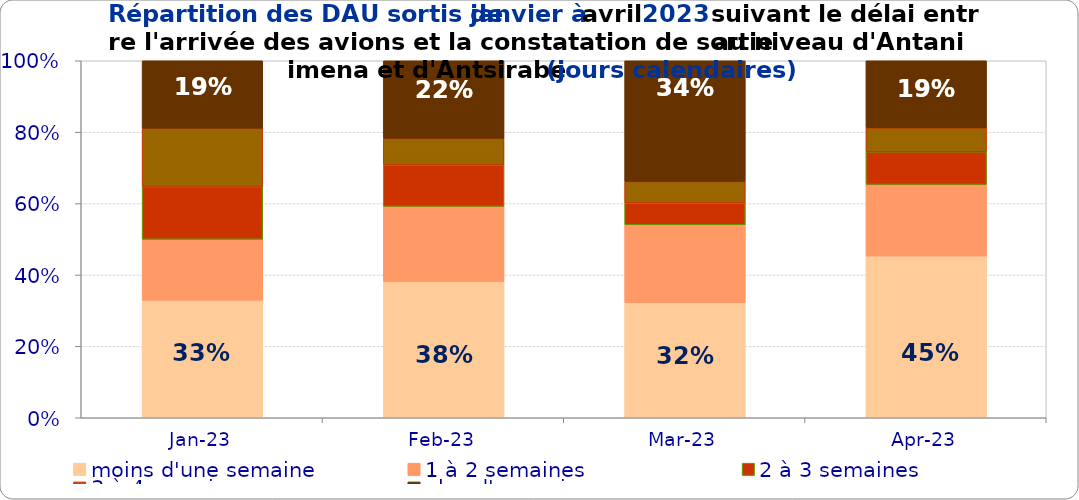
| Category | moins d'une semaine | 1 à 2 semaines | 2 à 3 semaines | 3 à 4 semaines | plus d'un mois |
|---|---|---|---|---|---|
| 2023-01-01 | 0.329 | 0.171 | 0.148 | 0.164 | 0.189 |
| 2023-02-01 | 0.382 | 0.21 | 0.116 | 0.075 | 0.217 |
| 2023-03-01 | 0.322 | 0.218 | 0.061 | 0.06 | 0.338 |
| 2023-04-01 | 0.453 | 0.2 | 0.092 | 0.067 | 0.188 |